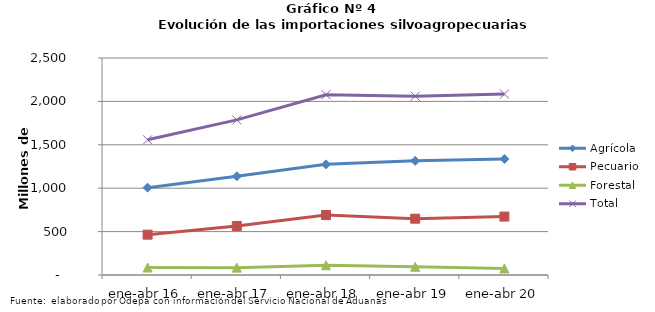
| Category | Agrícola | Pecuario | Forestal | Total |
|---|---|---|---|---|
| ene-abr 16 | 1006325 | 464822 | 86209 | 1557356 |
| ene-abr 17 | 1137244 | 564640 | 84838 | 1786722 |
| ene-abr 18 | 1274597 | 691209 | 111515 | 2077321 |
| ene-abr 19 | 1315327 | 648878 | 95395 | 2059600 |
| ene-abr 20 | 1336259 | 672978 | 75334 | 2084571 |